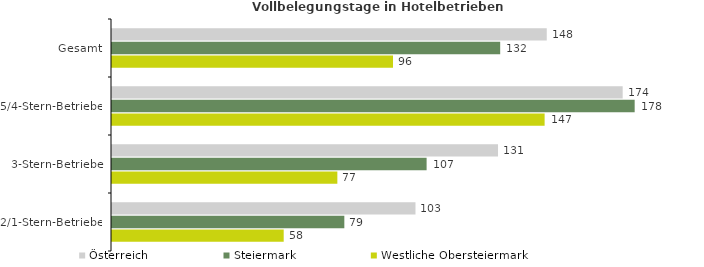
| Category | Österreich | Steiermark | Westliche Obersteiermark |
|---|---|---|---|
| Gesamt | 147.876 | 132.038 | 95.58 |
| 5/4-Stern-Betriebe | 173.697 | 177.779 | 147.149 |
| 3-Stern-Betriebe | 131.294 | 107.011 | 76.648 |
| 2/1-Stern-Betriebe | 103.222 | 79.024 | 58.401 |